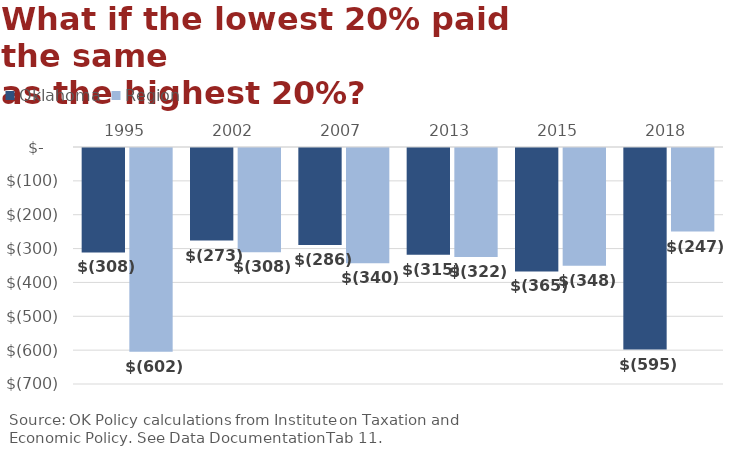
| Category | Oklahoma | Region |
|---|---|---|
| 1995.0 | -308.49 | -601.75 |
| 2002.0 | -273.43 | -308.1 |
| 2007.0 | -286.44 | -340.29 |
| 2013.0 | -315.36 | -321.81 |
| 2015.0 | -364.62 | -347.52 |
| 2018.0 | -595.2 | -246.675 |